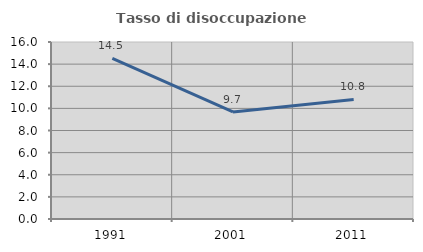
| Category | Tasso di disoccupazione giovanile  |
|---|---|
| 1991.0 | 14.516 |
| 2001.0 | 9.677 |
| 2011.0 | 10.811 |